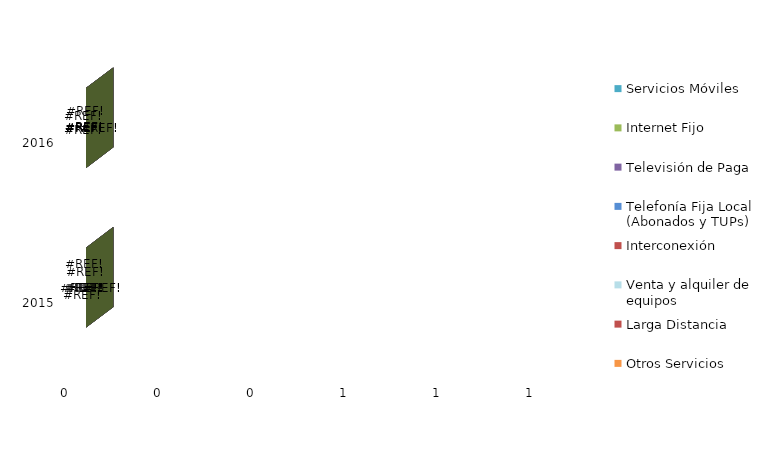
| Category | Servicios Móviles | Internet Fijo | Televisión de Paga | Telefonía Fija Local (Abonados y TUPs) | Interconexión | Venta y alquiler de equipos | Larga Distancia | Otros Servicios |
|---|---|---|---|---|---|---|---|---|
| 2015.0 | 0 | 0 | 0 | 0 | 0 | 0 | 0 | 0 |
| 2016.0 | 0 | 0 | 0 | 0 | 0 | 0 | 0 | 0 |